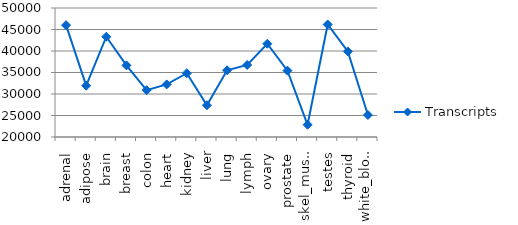
| Category | Transcripts |
|---|---|
| adrenal | 46008 |
| adipose | 31935 |
| brain | 43321 |
| breast | 36656 |
| colon | 30882 |
| heart | 32230 |
| kidney | 34832 |
| liver | 27384 |
| lung | 35517 |
| lymph | 36754 |
| ovary | 41690 |
| prostate | 35427 |
| skel_muscle | 22850 |
| testes | 46169 |
| thyroid | 39896 |
| white_blood | 25118 |